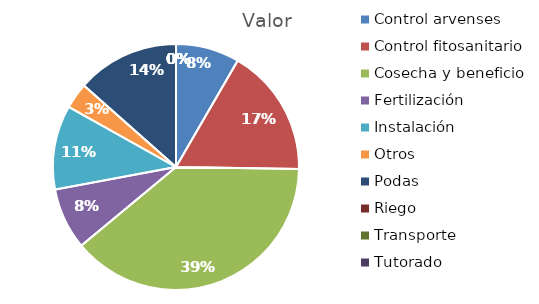
| Category | Valor |
|---|---|
| Control arvenses | 3923677 |
| Control fitosanitario | 7913857 |
| Cosecha y beneficio | 18155319 |
| Fertilización | 3790671 |
| Instalación | 5187234 |
| Otros | 1596072 |
| Podas | 6317785 |
| Riego | 0 |
| Transporte | 0 |
| Tutorado | 0 |